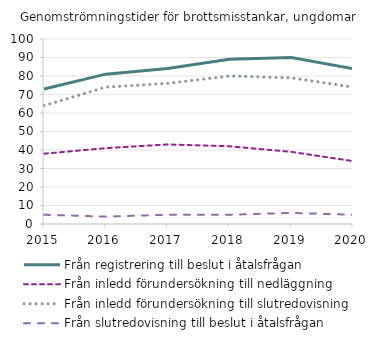
| Category | Från registrering till beslut i åtalsfrågan | Från inledd förundersökning till nedläggning | Från inledd förundersökning till slutredovisning | Från slutredovisning till beslut i åtalsfrågan |
|---|---|---|---|---|
| 2015 | 73 | 38 | 64 | 5 |
| 2016 | 81 | 41 | 74 | 4 |
| 2017 | 84 | 43 | 76 | 5 |
| 2018 | 89 | 42 | 80 | 5 |
| 2019 | 90 | 39 | 79 | 6 |
| 2020 | 84 | 34 | 74 | 5 |